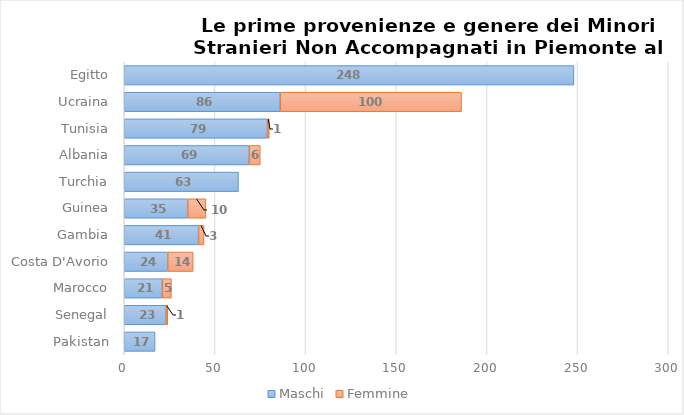
| Category | Maschi | Femmine |
|---|---|---|
| Pakistan | 17 | 0 |
| Senegal | 23 | 1 |
| Marocco | 21 | 5 |
| Costa D'Avorio | 24 | 14 |
| Gambia | 41 | 3 |
| Guinea | 35 | 10 |
| Turchia | 63 | 0 |
| Albania | 69 | 6 |
| Tunisia | 79 | 1 |
| Ucraina | 86 | 100 |
| Egitto | 248 | 0 |